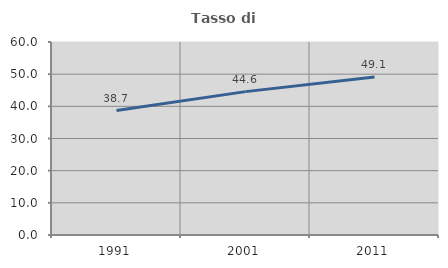
| Category | Tasso di occupazione   |
|---|---|
| 1991.0 | 38.698 |
| 2001.0 | 44.57 |
| 2011.0 | 49.101 |